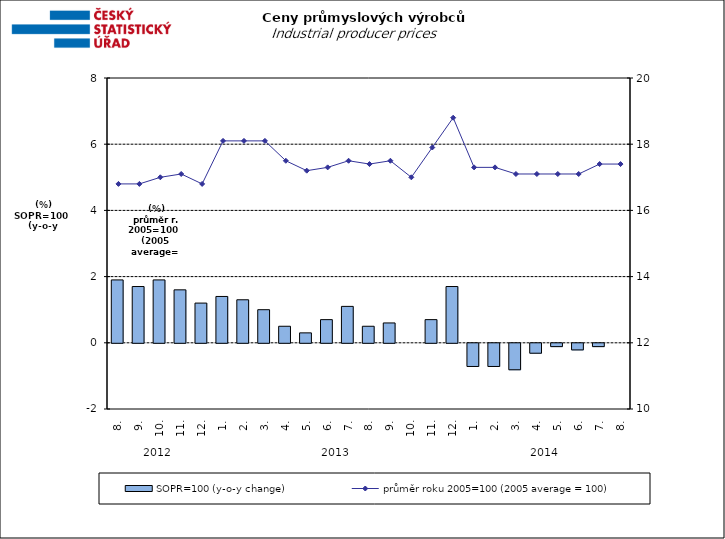
| Category | SOPR=100 (y-o-y change)   |
|---|---|
| 0 | 1.9 |
| 1 | 1.7 |
| 2 | 1.9 |
| 3 | 1.6 |
| 4 | 1.2 |
| 5 | 1.4 |
| 6 | 1.3 |
| 7 | 1 |
| 8 | 0.5 |
| 9 | 0.3 |
| 10 | 0.7 |
| 11 | 1.1 |
| 12 | 0.5 |
| 13 | 0.6 |
| 14 | 0 |
| 15 | 0.7 |
| 16 | 1.7 |
| 17 | -0.7 |
| 18 | -0.7 |
| 19 | -0.8 |
| 20 | -0.3 |
| 21 | -0.1 |
| 22 | -0.2 |
| 23 | -0.1 |
| 24 | 0 |